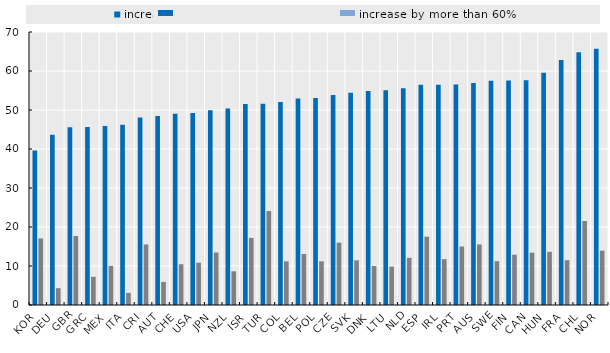
| Category | increase | increase by more than 60% |
|---|---|---|
| KOR | 39.647 | 17.08 |
| DEU | 43.639 | 4.31 |
| GBR | 45.576 | 17.702 |
| GRC | 45.657 | 7.227 |
| MEX | 45.895 | 10.041 |
| ITA | 46.188 | 3.116 |
| CRI | 48.093 | 15.525 |
| AUT | 48.443 | 5.919 |
| CHE | 49.026 | 10.458 |
| USA | 49.255 | 10.844 |
| JPN | 49.922 | 13.457 |
| NZL | 50.414 | 8.64 |
| ISR | 51.547 | 17.219 |
| TUR | 51.6 | 24.102 |
| COL | 52.02 | 11.192 |
| BEL | 52.94 | 13.086 |
| POL | 53.071 | 11.205 |
| CZE | 53.862 | 15.998 |
| SVK | 54.44 | 11.452 |
| DNK | 54.875 | 10.011 |
| LTU | 55.068 | 9.86 |
| NLD | 55.606 | 12.095 |
| ESP | 56.446 | 17.53 |
| IRL | 56.499 | 11.761 |
| PRT | 56.526 | 14.993 |
| AUS | 56.943 | 15.528 |
| SWE | 57.525 | 11.242 |
| FIN | 57.594 | 12.897 |
| CAN | 57.634 | 13.409 |
| HUN | 59.542 | 13.639 |
| FRA | 62.847 | 11.486 |
| CHL | 64.839 | 21.546 |
| NOR | 65.736 | 13.948 |